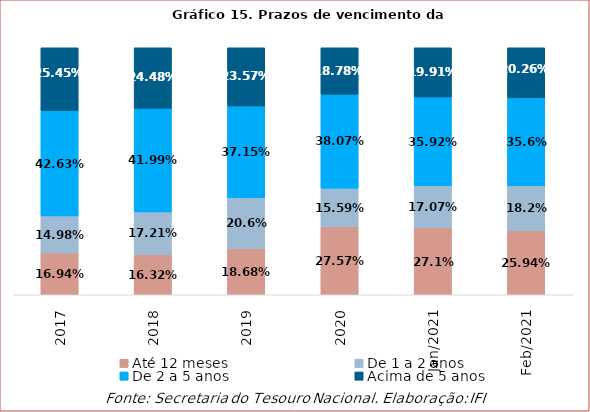
| Category | Até 12 meses | De 1 a 2 anos | De 2 a 5 anos | Acima de 5 anos |
|---|---|---|---|---|
| 2017.0 | 0.169 | 0.15 | 0.426 | 0.254 |
| 2018.0 | 0.163 | 0.172 | 0.42 | 0.245 |
| 2019.0 | 0.187 | 0.206 | 0.372 | 0.236 |
| 2020.0 | 0.276 | 0.156 | 0.381 | 0.188 |
| 44197.0 | 0.271 | 0.171 | 0.359 | 0.199 |
| 44228.0 | 0.259 | 0.182 | 0.356 | 0.203 |